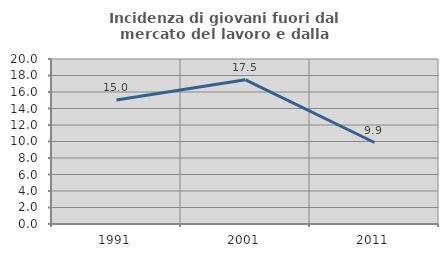
| Category | Incidenza di giovani fuori dal mercato del lavoro e dalla formazione  |
|---|---|
| 1991.0 | 15.033 |
| 2001.0 | 17.476 |
| 2011.0 | 9.877 |